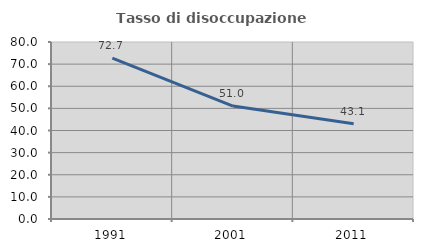
| Category | Tasso di disoccupazione giovanile  |
|---|---|
| 1991.0 | 72.698 |
| 2001.0 | 51.037 |
| 2011.0 | 43.085 |